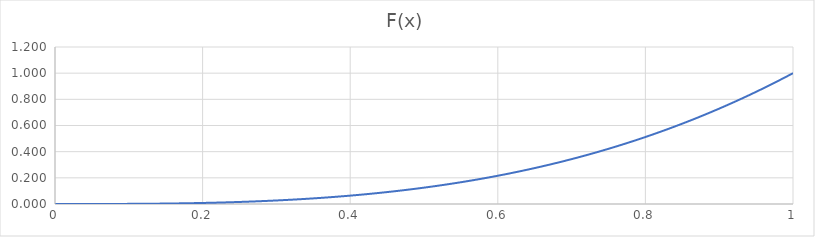
| Category | Series 0 |
|---|---|
| 0.0 | 0 |
| 0.01 | 0 |
| 0.02 | 0 |
| 0.03 | 0 |
| 0.04 | 0 |
| 0.05 | 0 |
| 0.06 | 0 |
| 0.07 | 0 |
| 0.08 | 0.001 |
| 0.09 | 0.001 |
| 0.1 | 0.001 |
| 0.11 | 0.001 |
| 0.12 | 0.002 |
| 0.13 | 0.002 |
| 0.14 | 0.003 |
| 0.15 | 0.003 |
| 0.16 | 0.004 |
| 0.17 | 0.005 |
| 0.18 | 0.006 |
| 0.19 | 0.007 |
| 0.2 | 0.008 |
| 0.21 | 0.009 |
| 0.22 | 0.011 |
| 0.23 | 0.012 |
| 0.24 | 0.014 |
| 0.25 | 0.016 |
| 0.26 | 0.018 |
| 0.27 | 0.02 |
| 0.28 | 0.022 |
| 0.29 | 0.024 |
| 0.3 | 0.027 |
| 0.31 | 0.03 |
| 0.32 | 0.033 |
| 0.33 | 0.036 |
| 0.34 | 0.039 |
| 0.35 | 0.043 |
| 0.36 | 0.047 |
| 0.37 | 0.051 |
| 0.38 | 0.055 |
| 0.39 | 0.059 |
| 0.4 | 0.064 |
| 0.41 | 0.069 |
| 0.42 | 0.074 |
| 0.43 | 0.08 |
| 0.44 | 0.085 |
| 0.45 | 0.091 |
| 0.46 | 0.097 |
| 0.47 | 0.104 |
| 0.48 | 0.111 |
| 0.49 | 0.118 |
| 0.5 | 0.125 |
| 0.51 | 0.133 |
| 0.52 | 0.141 |
| 0.53 | 0.149 |
| 0.54 | 0.157 |
| 0.55 | 0.166 |
| 0.56 | 0.176 |
| 0.57 | 0.185 |
| 0.58 | 0.195 |
| 0.59 | 0.205 |
| 0.6 | 0.216 |
| 0.61 | 0.227 |
| 0.62 | 0.238 |
| 0.63 | 0.25 |
| 0.64 | 0.262 |
| 0.65 | 0.275 |
| 0.66 | 0.287 |
| 0.67 | 0.301 |
| 0.68 | 0.314 |
| 0.69 | 0.329 |
| 0.7 | 0.343 |
| 0.71 | 0.358 |
| 0.72 | 0.373 |
| 0.73 | 0.389 |
| 0.74 | 0.405 |
| 0.75 | 0.422 |
| 0.76 | 0.439 |
| 0.77 | 0.457 |
| 0.78 | 0.475 |
| 0.79 | 0.493 |
| 0.8 | 0.512 |
| 0.81 | 0.531 |
| 0.82 | 0.551 |
| 0.83 | 0.572 |
| 0.84 | 0.593 |
| 0.85 | 0.614 |
| 0.86 | 0.636 |
| 0.87 | 0.659 |
| 0.88 | 0.681 |
| 0.89 | 0.705 |
| 0.9 | 0.729 |
| 0.91 | 0.754 |
| 0.92 | 0.779 |
| 0.93 | 0.804 |
| 0.94 | 0.831 |
| 0.95 | 0.857 |
| 0.96 | 0.885 |
| 0.97 | 0.913 |
| 0.98 | 0.941 |
| 0.99 | 0.97 |
| 1.0 | 1 |